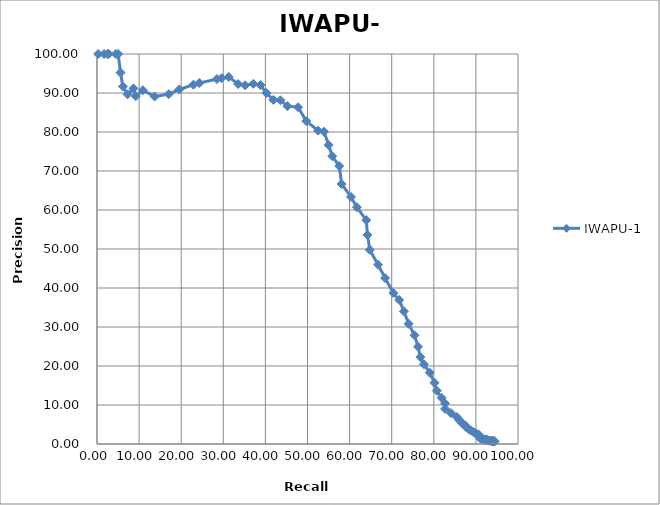
| Category | IWAPU-1 |
|---|---|
| 0.279 | 100 |
| 1.676 | 100 |
| 2.514 | 100 |
| 2.793 | 100 |
| 4.469 | 100 |
| 5.028 | 100 |
| 5.587 | 95.238 |
| 6.145 | 91.667 |
| 7.263 | 89.655 |
| 8.659 | 91.176 |
| 9.218 | 89.189 |
| 10.894 | 90.698 |
| 13.687 | 89.091 |
| 17.039 | 89.706 |
| 19.553 | 90.909 |
| 22.905 | 92.135 |
| 24.302 | 92.553 |
| 28.492 | 93.578 |
| 29.609 | 93.805 |
| 31.285 | 94.118 |
| 33.52 | 92.308 |
| 35.196 | 91.971 |
| 37.151 | 92.361 |
| 38.827 | 92.053 |
| 40.223 | 90 |
| 41.899 | 88.235 |
| 43.575 | 88.136 |
| 45.251 | 86.631 |
| 47.765 | 86.364 |
| 49.721 | 82.791 |
| 52.514 | 80.342 |
| 53.911 | 80.083 |
| 55.028 | 76.654 |
| 55.866 | 73.801 |
| 57.542 | 71.28 |
| 58.101 | 66.667 |
| 60.335 | 63.343 |
| 61.732 | 60.714 |
| 63.966 | 57.393 |
| 64.246 | 53.613 |
| 64.804 | 49.785 |
| 66.76 | 45.962 |
| 68.436 | 42.535 |
| 70.391 | 38.71 |
| 71.788 | 36.925 |
| 72.905 | 34.029 |
| 74.022 | 30.814 |
| 75.419 | 27.864 |
| 76.257 | 24.932 |
| 76.816 | 22.285 |
| 77.654 | 20.456 |
| 79.05 | 18.258 |
| 80.168 | 15.7 |
| 80.726 | 13.651 |
| 81.844 | 11.848 |
| 82.682 | 10.412 |
| 82.682 | 8.997 |
| 84.078 | 7.925 |
| 85.475 | 6.923 |
| 86.034 | 6.151 |
| 86.592 | 5.452 |
| 87.43 | 4.822 |
| 87.709 | 4.291 |
| 88.268 | 3.863 |
| 88.827 | 3.442 |
| 89.385 | 3.072 |
| 89.944 | 2.768 |
| 90.503 | 2.502 |
| 90.782 | 2.252 |
| 90.782 | 2.024 |
| 90.782 | 1.852 |
| 90.782 | 1.7 |
| 91.061 | 1.574 |
| 91.061 | 1.464 |
| 91.341 | 1.36 |
| 91.62 | 1.269 |
| 92.179 | 1.192 |
| 92.179 | 1.117 |
| 92.458 | 1.056 |
| 92.737 | 1.005 |
| 92.737 | 0.96 |
| 92.737 | 0.93 |
| 93.017 | 0.908 |
| 93.017 | 0.886 |
| 93.017 | 0.866 |
| 93.296 | 0.848 |
| 93.855 | 0.833 |
| 93.855 | 0.814 |
| 93.855 | 0.794 |
| 93.855 | 0.777 |
| 93.855 | 0.759 |
| 93.855 | 0.744 |
| 93.855 | 0.728 |
| 93.855 | 0.716 |
| 93.855 | 0.705 |
| 94.134 | 0.697 |
| 94.134 | 0.691 |
| 94.134 | 0.687 |
| 94.134 | 0.682 |
| 94.413 | 0.68 |
| 94.413 | 0.676 |